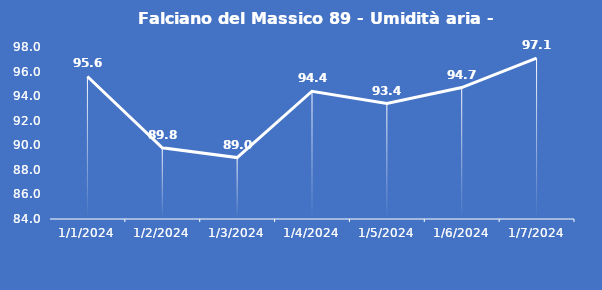
| Category | Falciano del Massico 89 - Umidità aria - Grezzo (%) |
|---|---|
| 1/1/24 | 95.6 |
| 1/2/24 | 89.8 |
| 1/3/24 | 89 |
| 1/4/24 | 94.4 |
| 1/5/24 | 93.4 |
| 1/6/24 | 94.7 |
| 1/7/24 | 97.1 |